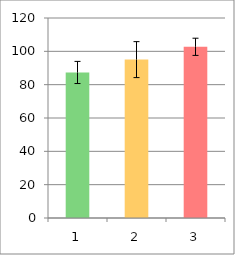
| Category | Series 0 |
|---|---|
| 0 | 87.322 |
| 1 | 95.029 |
| 2 | 102.717 |